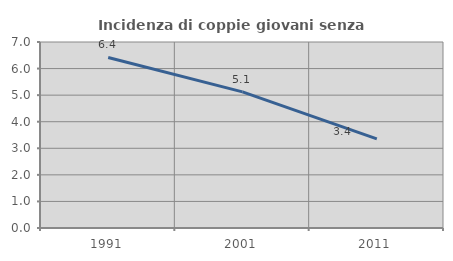
| Category | Incidenza di coppie giovani senza figli |
|---|---|
| 1991.0 | 6.419 |
| 2001.0 | 5.121 |
| 2011.0 | 3.355 |